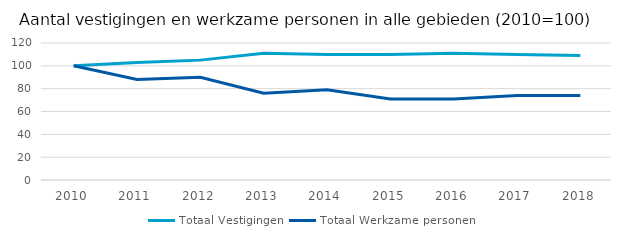
| Category | Totaal |
|---|---|
| 2010.0 | 100 |
| 2011.0 | 88 |
| 2012.0 | 90 |
| 2013.0 | 76 |
| 2014.0 | 79 |
| 2015.0 | 71 |
| 2016.0 | 71 |
| 2017.0 | 74 |
| 2018.0 | 74 |